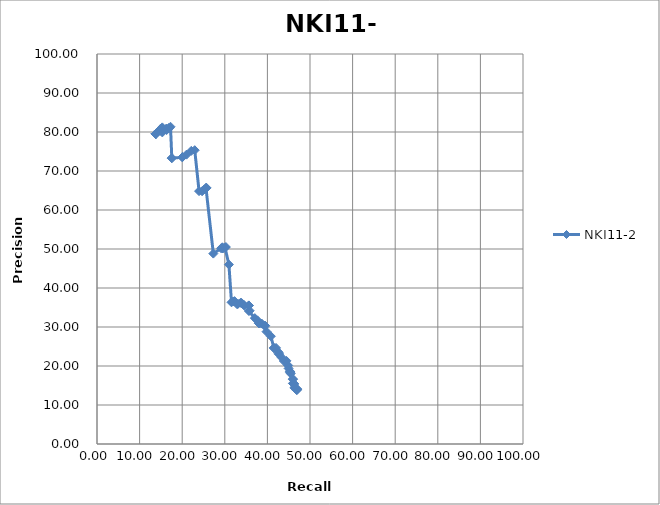
| Category | NKI11-2 |
|---|---|
| 13.807 | 79.532 |
| 13.807 | 79.532 |
| 13.807 | 79.532 |
| 13.807 | 79.532 |
| 13.807 | 79.532 |
| 13.807 | 79.532 |
| 13.807 | 79.532 |
| 14.416 | 80.226 |
| 14.518 | 80.337 |
| 14.518 | 80.337 |
| 14.619 | 80.447 |
| 14.822 | 80.663 |
| 14.822 | 80.663 |
| 14.822 | 80.663 |
| 15.025 | 80.874 |
| 15.33 | 81.183 |
| 15.33 | 79.894 |
| 16.244 | 80.808 |
| 16.244 | 80.808 |
| 16.345 | 80.5 |
| 16.853 | 80.976 |
| 16.853 | 80.976 |
| 17.259 | 81.34 |
| 17.563 | 73.305 |
| 17.563 | 73.305 |
| 20.0 | 73.507 |
| 20.102 | 73.606 |
| 21.015 | 74.194 |
| 22.132 | 75.172 |
| 22.944 | 75.333 |
| 23.959 | 64.835 |
| 24.67 | 64.8 |
| 25.178 | 65.263 |
| 25.584 | 65.625 |
| 25.584 | 65.625 |
| 25.685 | 65.714 |
| 27.31 | 48.82 |
| 29.137 | 50.175 |
| 29.442 | 50.435 |
| 29.543 | 50.172 |
| 29.543 | 50.172 |
| 30.051 | 50.34 |
| 30.254 | 50.508 |
| 30.964 | 46.003 |
| 31.574 | 36.332 |
| 31.98 | 36.543 |
| 32.284 | 36.636 |
| 32.893 | 35.841 |
| 33.096 | 35.943 |
| 33.706 | 36.205 |
| 33.909 | 36.186 |
| 34.518 | 35.602 |
| 34.518 | 35.565 |
| 35.635 | 35.526 |
| 35.635 | 35.526 |
| 35.635 | 34.111 |
| 35.838 | 34.172 |
| 37.056 | 32.272 |
| 37.665 | 31.709 |
| 37.97 | 30.96 |
| 38.173 | 30.921 |
| 38.68 | 30.875 |
| 39.289 | 30.353 |
| 39.492 | 30.32 |
| 39.797 | 28.802 |
| 40.812 | 27.629 |
| 41.523 | 24.624 |
| 41.523 | 24.624 |
| 42.03 | 24.628 |
| 42.64 | 23.503 |
| 42.64 | 23.166 |
| 42.741 | 23.043 |
| 43.35 | 22.182 |
| 43.858 | 21.281 |
| 44.467 | 21.324 |
| 44.873 | 20.146 |
| 44.975 | 19.387 |
| 45.279 | 18.661 |
| 45.279 | 18.43 |
| 45.381 | 18.448 |
| 45.482 | 18.057 |
| 45.99 | 16.642 |
| 45.99 | 16.642 |
| 45.99 | 15.54 |
| 46.091 | 15.548 |
| 46.193 | 15.492 |
| 46.294 | 15.385 |
| 46.396 | 14.526 |
| 46.497 | 14.439 |
| 46.497 | 14.295 |
| 46.497 | 14.259 |
| 46.701 | 14.281 |
| 46.701 | 14.281 |
| 46.802 | 14.176 |
| 46.802 | 14.176 |
| 46.904 | 14.137 |
| 46.904 | 14.051 |
| 46.904 | 14.051 |
| 46.904 | 14.051 |
| 46.904 | 14.051 |
| 46.904 | 13.783 |